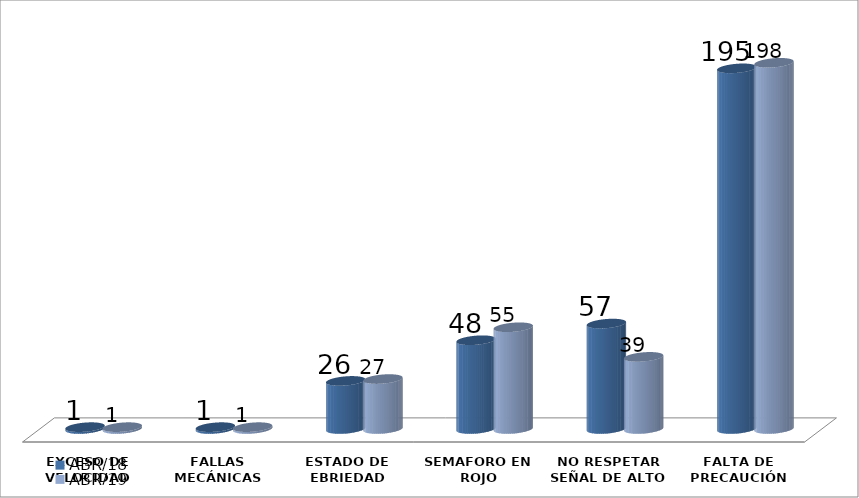
| Category | ABR/18 | ABR/19 |
|---|---|---|
| EXCESO DE VELOCIDAD | 1 | 1 |
| FALLAS MECÁNICAS | 1 | 1 |
| ESTADO DE EBRIEDAD | 26 | 27 |
| SEMAFORO EN ROJO | 48 | 55 |
| NO RESPETAR SEÑAL DE ALTO | 57 | 39 |
| FALTA DE PRECAUCIÓN | 195 | 198 |